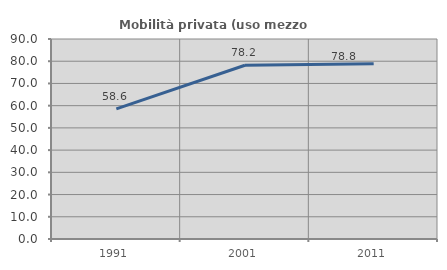
| Category | Mobilità privata (uso mezzo privato) |
|---|---|
| 1991.0 | 58.571 |
| 2001.0 | 78.205 |
| 2011.0 | 78.824 |